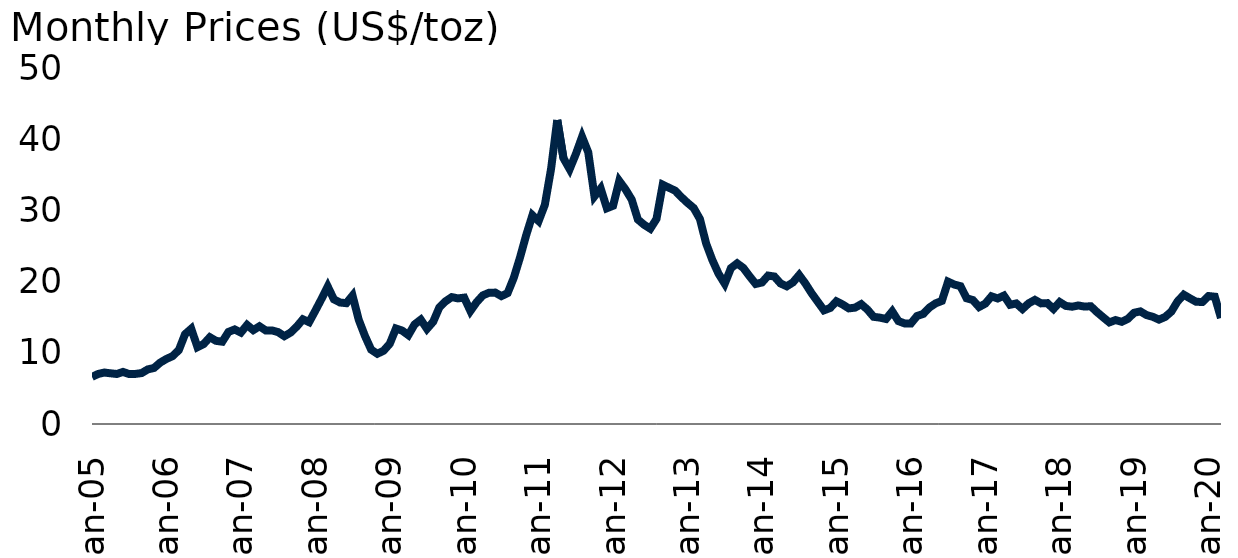
| Category | Silver |
|---|---|
| 2005-01-01 | 6.619 |
| 2005-02-01 | 7.03 |
| 2005-03-01 | 7.228 |
| 2005-04-01 | 7.119 |
| 2005-05-01 | 7.022 |
| 2005-06-01 | 7.31 |
| 2005-07-01 | 7.014 |
| 2005-08-01 | 7.033 |
| 2005-09-01 | 7.154 |
| 2005-10-01 | 7.67 |
| 2005-11-01 | 7.872 |
| 2005-12-01 | 8.627 |
| 2006-01-01 | 9.139 |
| 2006-02-01 | 9.535 |
| 2006-03-01 | 10.384 |
| 2006-04-01 | 12.614 |
| 2006-05-01 | 13.377 |
| 2006-06-01 | 10.796 |
| 2006-07-01 | 11.232 |
| 2006-08-01 | 12.187 |
| 2006-09-01 | 11.677 |
| 2006-10-01 | 11.559 |
| 2006-11-01 | 12.931 |
| 2006-12-01 | 13.279 |
| 2007-01-01 | 12.841 |
| 2007-02-01 | 13.91 |
| 2007-03-01 | 13.184 |
| 2007-04-01 | 13.723 |
| 2007-05-01 | 13.148 |
| 2007-06-01 | 13.144 |
| 2007-07-01 | 12.909 |
| 2007-08-01 | 12.334 |
| 2007-09-01 | 12.834 |
| 2007-10-01 | 13.67 |
| 2007-11-01 | 14.702 |
| 2007-12-01 | 14.304 |
| 2008-01-01 | 15.909 |
| 2008-02-01 | 17.569 |
| 2008-03-01 | 19.317 |
| 2008-04-01 | 17.5 |
| 2008-05-01 | 17.06 |
| 2008-06-01 | 16.969 |
| 2008-07-01 | 18.034 |
| 2008-08-01 | 14.635 |
| 2008-09-01 | 12.373 |
| 2008-10-01 | 10.441 |
| 2008-11-01 | 9.865 |
| 2008-12-01 | 10.286 |
| 2009-01-01 | 11.268 |
| 2009-02-01 | 13.412 |
| 2009-03-01 | 13.117 |
| 2009-04-01 | 12.479 |
| 2009-05-01 | 13.984 |
| 2009-06-01 | 14.654 |
| 2009-07-01 | 13.362 |
| 2009-08-01 | 14.357 |
| 2009-09-01 | 16.39 |
| 2009-10-01 | 17.236 |
| 2009-11-01 | 17.821 |
| 2009-12-01 | 17.642 |
| 2010-01-01 | 17.749 |
| 2010-02-01 | 15.873 |
| 2010-03-01 | 17.106 |
| 2010-04-01 | 18.062 |
| 2010-05-01 | 18.433 |
| 2010-06-01 | 18.455 |
| 2010-07-01 | 17.96 |
| 2010-08-01 | 18.388 |
| 2010-09-01 | 20.55 |
| 2010-10-01 | 23.393 |
| 2010-11-01 | 26.541 |
| 2010-12-01 | 29.325 |
| 2011-01-01 | 28.509 |
| 2011-02-01 | 30.778 |
| 2011-03-01 | 35.814 |
| 2011-04-01 | 42.695 |
| 2011-05-01 | 37.336 |
| 2011-06-01 | 35.795 |
| 2011-07-01 | 37.917 |
| 2011-08-01 | 40.331 |
| 2011-09-01 | 38.154 |
| 2011-10-01 | 31.975 |
| 2011-11-01 | 33.082 |
| 2011-12-01 | 30.303 |
| 2012-01-01 | 30.651 |
| 2012-02-01 | 34.14 |
| 2012-03-01 | 32.953 |
| 2012-04-01 | 31.526 |
| 2012-05-01 | 28.72 |
| 2012-06-01 | 27.984 |
| 2012-07-01 | 27.432 |
| 2012-08-01 | 28.8 |
| 2012-09-01 | 33.608 |
| 2012-10-01 | 33.187 |
| 2012-11-01 | 32.773 |
| 2012-12-01 | 31.874 |
| 2013-01-01 | 31.062 |
| 2013-02-01 | 30.329 |
| 2013-03-01 | 28.791 |
| 2013-04-01 | 25.355 |
| 2013-05-01 | 23.038 |
| 2013-06-01 | 21.109 |
| 2013-07-01 | 19.71 |
| 2013-08-01 | 21.894 |
| 2013-09-01 | 22.564 |
| 2013-10-01 | 21.917 |
| 2013-11-01 | 20.758 |
| 2013-12-01 | 19.67 |
| 2014-01-01 | 19.875 |
| 2014-02-01 | 20.845 |
| 2014-03-01 | 20.716 |
| 2014-04-01 | 19.736 |
| 2014-05-01 | 19.342 |
| 2014-06-01 | 19.892 |
| 2014-07-01 | 20.923 |
| 2014-08-01 | 19.736 |
| 2014-09-01 | 18.369 |
| 2014-10-01 | 17.163 |
| 2014-11-01 | 15.966 |
| 2014-12-01 | 16.295 |
| 2015-01-01 | 17.236 |
| 2015-02-01 | 16.787 |
| 2015-03-01 | 16.24 |
| 2015-04-01 | 16.341 |
| 2015-05-01 | 16.833 |
| 2015-06-01 | 16.075 |
| 2015-07-01 | 15.053 |
| 2015-08-01 | 14.941 |
| 2015-09-01 | 14.75 |
| 2015-10-01 | 15.813 |
| 2015-11-01 | 14.452 |
| 2015-12-01 | 14.127 |
| 2016-01-01 | 14.106 |
| 2016-02-01 | 15.167 |
| 2016-03-01 | 15.465 |
| 2016-04-01 | 16.36 |
| 2016-05-01 | 16.947 |
| 2016-06-01 | 17.286 |
| 2016-07-01 | 19.992 |
| 2016-08-01 | 19.587 |
| 2016-09-01 | 19.357 |
| 2016-10-01 | 17.655 |
| 2016-11-01 | 17.407 |
| 2016-12-01 | 16.432 |
| 2017-01-01 | 16.902 |
| 2017-02-01 | 17.933 |
| 2017-03-01 | 17.631 |
| 2017-04-01 | 18.033 |
| 2017-05-01 | 16.745 |
| 2017-06-01 | 16.931 |
| 2017-07-01 | 16.152 |
| 2017-08-01 | 16.952 |
| 2017-09-01 | 17.432 |
| 2017-10-01 | 16.941 |
| 2017-11-01 | 16.977 |
| 2017-12-01 | 16.165 |
| 2018-01-01 | 17.127 |
| 2018-02-01 | 16.582 |
| 2018-03-01 | 16.473 |
| 2018-04-01 | 16.648 |
| 2018-05-01 | 16.49 |
| 2018-06-01 | 16.541 |
| 2018-07-01 | 15.723 |
| 2018-08-01 | 14.987 |
| 2018-09-01 | 14.272 |
| 2018-10-01 | 14.597 |
| 2018-11-01 | 14.353 |
| 2018-12-01 | 14.772 |
| 2019-01-01 | 15.624 |
| 2019-02-01 | 15.815 |
| 2019-03-01 | 15.296 |
| 2019-04-01 | 15.055 |
| 2019-05-01 | 14.662 |
| 2019-06-01 | 15.036 |
| 2019-07-01 | 15.791 |
| 2019-08-01 | 17.224 |
| 2019-09-01 | 18.16 |
| 2019-10-01 | 17.645 |
| 2019-11-01 | 17.165 |
| 2019-12-01 | 17.138 |
| 2020-01-01 | 17.972 |
| 2020-02-01 | 17.88 |
| 2020-03-01 | 14.884 |